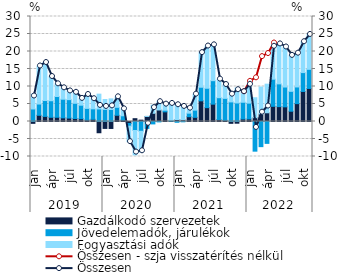
| Category | Gazdálkodó szervezetek | Jövedelemadók, járulékok | Fogyasztási adók |
|---|---|---|---|
| 0 | -0.527 | 3.58 | 4.234 |
| 1 | 1.772 | 3.218 | 10.866 |
| 2 | 1.459 | 4.532 | 10.864 |
| 3 | 1.205 | 4.726 | 6.921 |
| 4 | 1.208 | 5.935 | 3.624 |
| 5 | 1.043 | 5.328 | 3.256 |
| 6 | 0.987 | 5.26 | 2.488 |
| 7 | 0.861 | 4.346 | 3.135 |
| 8 | 0.792 | 3.865 | 1.948 |
| 9 | 0.435 | 3.31 | 3.975 |
| 10 | 0.634 | 2.986 | 2.891 |
| 11 | -3.213 | 3.59 | 4.224 |
| 12 | -1.976 | 3.45 | 2.832 |
| 13 | -1.989 | 3.421 | 3.038 |
| 14 | 1.781 | 2.274 | 3.006 |
| 15 | 0.406 | 1.231 | 1.975 |
| 16 | -0.559 | -0.78 | -4.415 |
| 17 | 0.801 | -2.564 | -6.973 |
| 18 | 0.384 | -2.793 | -5.955 |
| 19 | 1.44 | -1.969 | 0.018 |
| 20 | 2.347 | -0.689 | 2.308 |
| 21 | 3.295 | -0.11 | 2.486 |
| 22 | 2.762 | 0.464 | 1.731 |
| 23 | 0.106 | 0.255 | 4.802 |
| 24 | 0.572 | -0.223 | 4.439 |
| 25 | 0.497 | -0.084 | 3.905 |
| 26 | 1.377 | 1.005 | 1.427 |
| 27 | 1.191 | 2.054 | 4.574 |
| 28 | 5.907 | 3.881 | 9.892 |
| 29 | 3.958 | 5.539 | 12.065 |
| 30 | 4.954 | 6.711 | 10.241 |
| 31 | 0.574 | 6.229 | 5.305 |
| 32 | 0.349 | 6.26 | 3.958 |
| 33 | -0.523 | 5.599 | 2.731 |
| 34 | -0.486 | 5.299 | 4.279 |
| 35 | 0.721 | 4.777 | 3.018 |
| 36 | 0.722 | 4.531 | 5.37 |
| 37 | 1.09 | -8.475 | 5.696 |
| 38 | 2.117 | -7.185 | 7.726 |
| 39 | 2.491 | -6.25 | 8.175 |
| 40 | 4.337 | 7.75 | 9.398 |
| 41 | 4.249 | 6.505 | 11.421 |
| 42 | 4.188 | 5.661 | 11.44 |
| 43 | 2.939 | 5.682 | 10.271 |
| 44 | 5.106 | 4.763 | 9.651 |
| 45 | 8.585 | 5.392 | 8.817 |
| 46 | 9.439 | 5.469 | 9.966 |